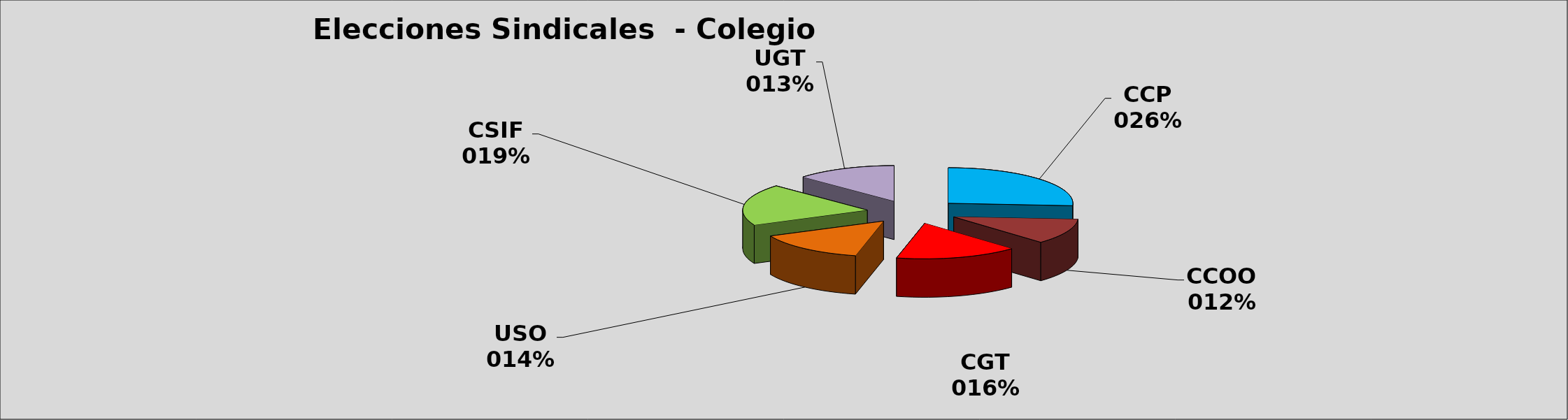
| Category | ESPECIALISTAS Y NO CUALIFICADOS |
|---|---|
| CCP | 90 |
| CCOO | 40 |
| CGT | 55 |
| USO | 50 |
| CSIF | 65 |
| UGT | 45 |